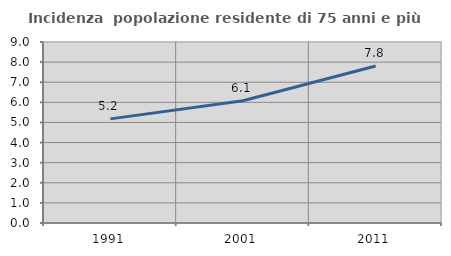
| Category | Incidenza  popolazione residente di 75 anni e più |
|---|---|
| 1991.0 | 5.178 |
| 2001.0 | 6.082 |
| 2011.0 | 7.803 |